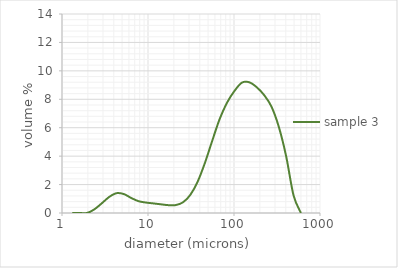
| Category | sample 3 |
|---|---|
| 1.32 | 0 |
| 1.6 | 0 |
| 1.95 | 0 |
| 2.38 | 0.258 |
| 2.9 | 0.68 |
| 3.53 | 1.126 |
| 4.3 | 1.394 |
| 5.24 | 1.333 |
| 6.39 | 1.054 |
| 7.78 | 0.829 |
| 9.48 | 0.735 |
| 11.55 | 0.674 |
| 14.08 | 0.612 |
| 17.15 | 0.553 |
| 20.9 | 0.555 |
| 25.46 | 0.749 |
| 31.01 | 1.271 |
| 37.79 | 2.206 |
| 46.03 | 3.544 |
| 56.09 | 5.119 |
| 68.33 | 6.632 |
| 83.26 | 7.777 |
| 101.44 | 8.593 |
| 123.59 | 9.171 |
| 150.57001 | 9.194 |
| 183.44 | 8.852 |
| 223.50999 | 8.303 |
| 272.31 | 7.491 |
| 331.76999 | 6.065 |
| 404.20999 | 3.988 |
| 492.47 | 1.241 |
| 600.0 | 0 |